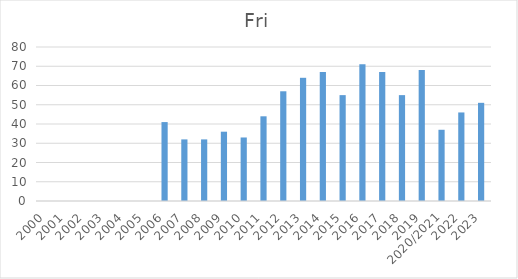
| Category | Fri |
|---|---|
| 2000 | 0 |
| 2001 | 0 |
| 2002 | 0 |
| 2003 | 0 |
| 2004 | 0 |
| 2005 | 0 |
| 2006 | 41 |
| 2007 | 32 |
| 2008 | 32 |
| 2009 | 36 |
| 2010 | 33 |
| 2011 | 44 |
| 2012 | 57 |
| 2013 | 64 |
| 2014 | 67 |
| 2015 | 55 |
| 2016 | 71 |
| 2017 | 67 |
| 2018 | 55 |
| 2019 | 68 |
| 2020/2021 | 37 |
| 2022 | 46 |
| 2023 | 51 |